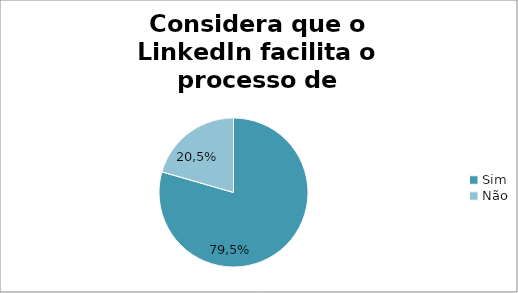
| Category | Considera que o LinkedIn facilita o processo de recrutamento |
|---|---|
| Sim | 79.459 |
| Não | 20.541 |